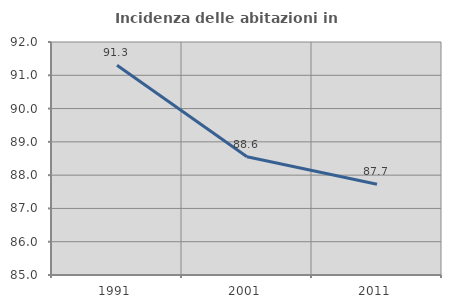
| Category | Incidenza delle abitazioni in proprietà  |
|---|---|
| 1991.0 | 91.3 |
| 2001.0 | 88.551 |
| 2011.0 | 87.728 |